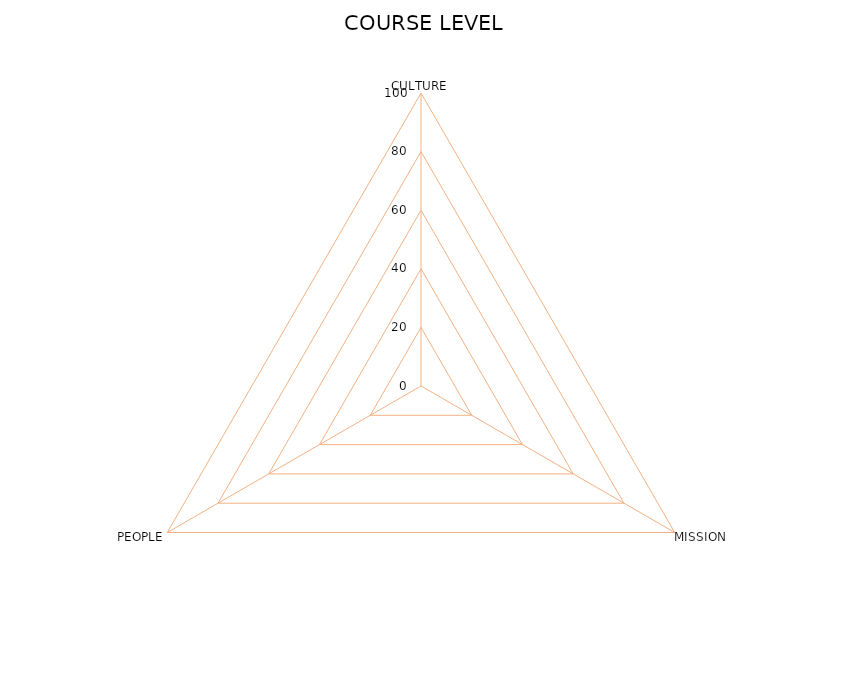
| Category | Series 0 |
|---|---|
| CULTURE | 0 |
| MISSION | 0 |
| PEOPLE | 0 |